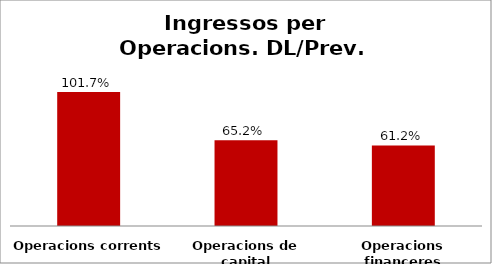
| Category | Series 0 |
|---|---|
| Operacions corrents | 1.017 |
| Operacions de capital | 0.652 |
| Operacions financeres | 0.612 |